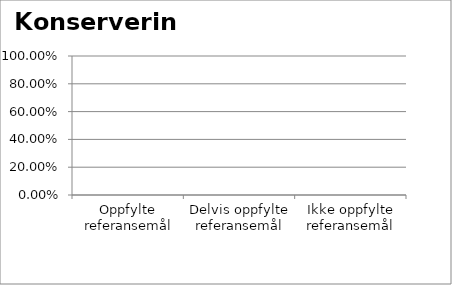
| Category | Konservering |
|---|---|
| Oppfylte referansemål | 0 |
| Delvis oppfylte referansemål | 0 |
| Ikke oppfylte referansemål | 0 |